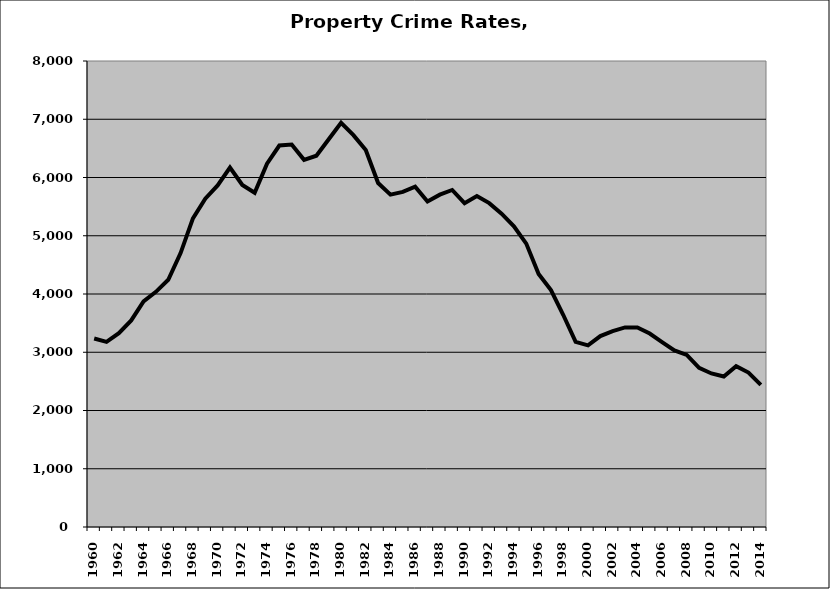
| Category | Property |
|---|---|
| 1960.0 | 3235.378 |
| 1961.0 | 3177.459 |
| 1962.0 | 3326.17 |
| 1963.0 | 3545.816 |
| 1964.0 | 3874.309 |
| 1965.0 | 4037.184 |
| 1966.0 | 4244.339 |
| 1967.0 | 4702.955 |
| 1968.0 | 5298.179 |
| 1969.0 | 5637.417 |
| 1970.0 | 5864.307 |
| 1971.0 | 6171.532 |
| 1972.0 | 5872.425 |
| 1973.0 | 5739.085 |
| 1974.0 | 6236.237 |
| 1975.0 | 6549.214 |
| 1976.0 | 6564.665 |
| 1977.0 | 6302.699 |
| 1978.0 | 6373.271 |
| 1979.0 | 6657.653 |
| 1980.0 | 6939.465 |
| 1981.0 | 6727.522 |
| 1982.0 | 6470.745 |
| 1983.0 | 5904.85 |
| 1984.0 | 5704.984 |
| 1985.0 | 5752.74 |
| 1986.0 | 5842.256 |
| 1987.0 | 5588.432 |
| 1988.0 | 5705.694 |
| 1989.0 | 5785.762 |
| 1990.0 | 5558.417 |
| 1991.0 | 5682.656 |
| 1992.0 | 5559.779 |
| 1993.0 | 5379.142 |
| 1994.0 | 5160.835 |
| 1995.0 | 4865.08 |
| 1996.0 | 4345.113 |
| 1997.0 | 4067.085 |
| 1998.0 | 3639.119 |
| 1999.0 | 3177.798 |
| 2000.0 | 3118.192 |
| 2001.0 | 3277.959 |
| 2002.0 | 3361.192 |
| 2003.0 | 3426.376 |
| 2004.0 | 3423.896 |
| 2005.0 | 3320.59 |
| 2006.0 | 3175.175 |
| 2007.0 | 3032.647 |
| 2008.0 | 2954.497 |
| 2009.0 | 2731.027 |
| 2010.0 | 2635.798 |
| 2011.0 | 2584.184 |
| 2012.0 | 2761.759 |
| 2013.0 | 2651.236 |
| 2014.0 | 2441.059 |